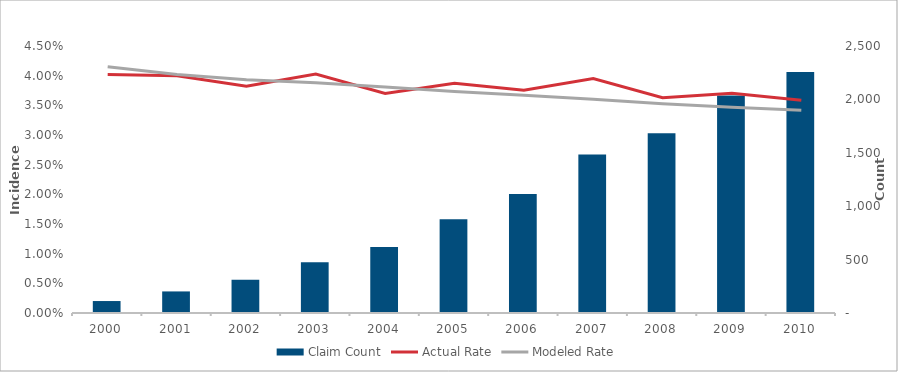
| Category | Claim Count |
|---|---|
| 2000.0 | 112 |
| 2001.0 | 202 |
| 2002.0 | 311 |
| 2003.0 | 475 |
| 2004.0 | 619 |
| 2005.0 | 878 |
| 2006.0 | 1114 |
| 2007.0 | 1484 |
| 2008.0 | 1683 |
| 2009.0 | 2037 |
| 2010.0 | 2256 |